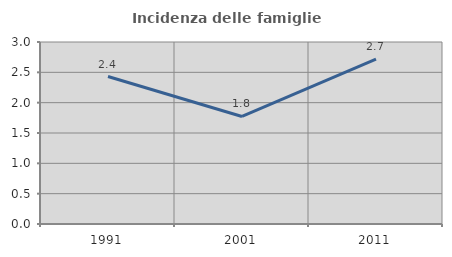
| Category | Incidenza delle famiglie numerose |
|---|---|
| 1991.0 | 2.431 |
| 2001.0 | 1.772 |
| 2011.0 | 2.716 |